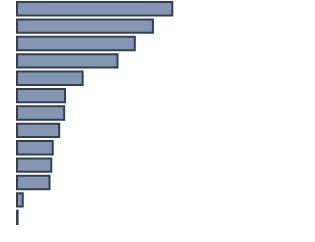
| Category | Percentatge |
|---|---|
| 0 | 53 |
| 1 | 46.4 |
| 2 | 40.2 |
| 3 | 34.3 |
| 4 | 22.4 |
| 5 | 16.4 |
| 6 | 16.1 |
| 7 | 14.4 |
| 8 | 12.2 |
| 9 | 11.7 |
| 10 | 11.1 |
| 11 | 2 |
| 12 | 0.2 |